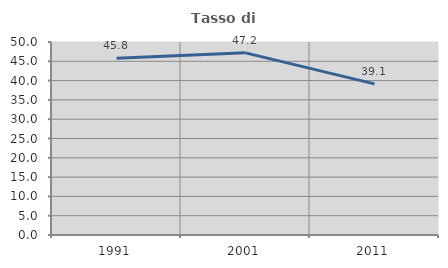
| Category | Tasso di occupazione   |
|---|---|
| 1991.0 | 45.767 |
| 2001.0 | 47.185 |
| 2011.0 | 39.145 |